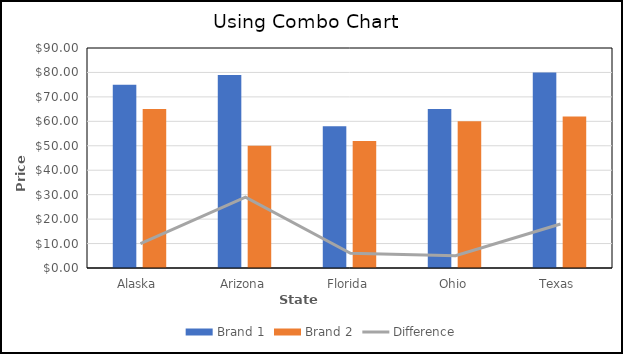
| Category | Brand 1 | Brand 2 |
|---|---|---|
| Alaska | 75 | 65 |
| Arizona | 79 | 50 |
| Florida | 58 | 52 |
| Ohio | 65 | 60 |
| Texas | 80 | 62 |